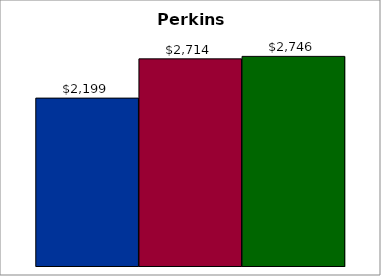
| Category | 50 states and D.C. | SREB states | State |
|---|---|---|---|
| 0 | 2199.367 | 2713.627 | 2746.115 |